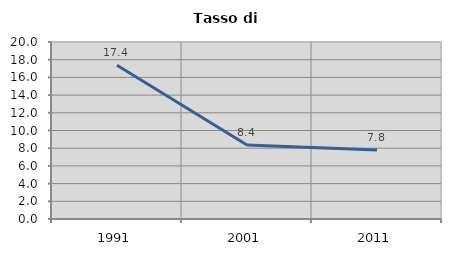
| Category | Tasso di disoccupazione   |
|---|---|
| 1991.0 | 17.367 |
| 2001.0 | 8.366 |
| 2011.0 | 7.783 |